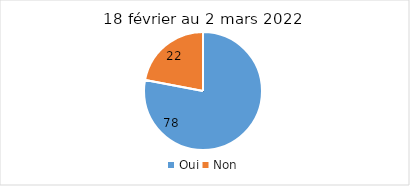
| Category | 18 février au 2 mars 2022 |
|---|---|
| Oui | 78 |
| Non | 22 |